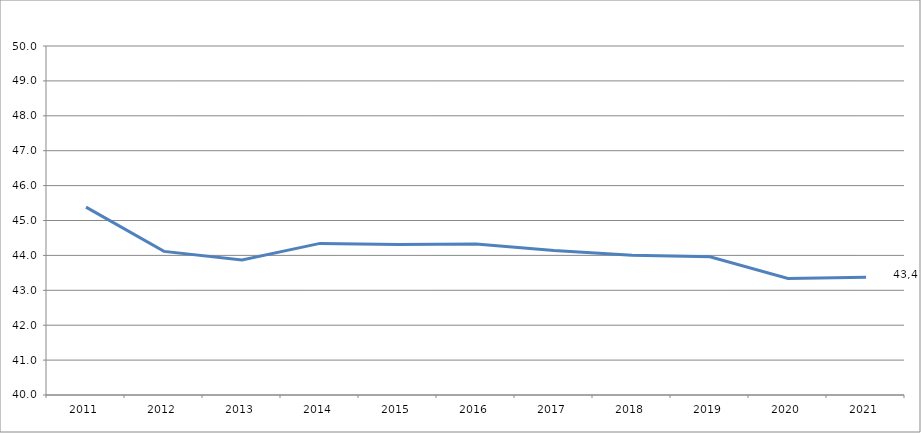
| Category | Part des spécialités de la production (%) |
|---|---|
| 2011.0 | 45.384 |
| 2012.0 | 44.114 |
| 2013.0 | 43.868 |
| 2014.0 | 44.344 |
| 2015.0 | 44.314 |
| 2016.0 | 44.324 |
| 2017.0 | 44.14 |
| 2018.0 | 44.005 |
| 2019.0 | 43.96 |
| 2020.0 | 43.338 |
| 2021.0 | 43.375 |